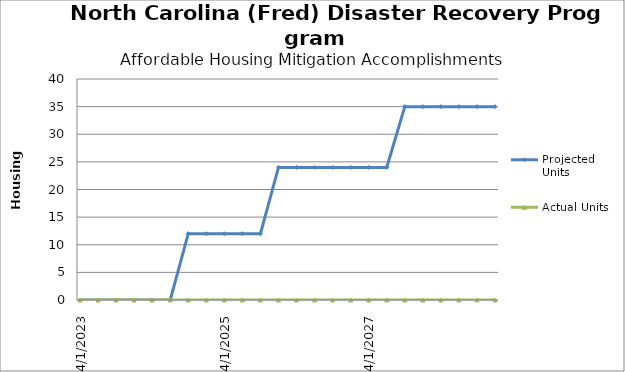
| Category | Projected Units | Actual Units |
|---|---|---|
| 4/1/23 | 0 | 0 |
| 7/1/23 | 0 | 0 |
| 10/1/23 | 0 | 0 |
| 1/1/24 | 0 | 0 |
| 4/1/24 | 0 | 0 |
| 7/1/24 | 0 | 0 |
| 10/1/24 | 12 | 0 |
| 1/1/25 | 12 | 0 |
| 4/1/25 | 12 | 0 |
| 7/1/25 | 12 | 0 |
| 10/1/25 | 12 | 0 |
| 1/1/26 | 24 | 0 |
| 4/1/26 | 24 | 0 |
| 7/1/26 | 24 | 0 |
| 10/1/26 | 24 | 0 |
| 1/1/27 | 24 | 0 |
| 4/1/27 | 24 | 0 |
| 7/1/27 | 24 | 0 |
| 10/1/27 | 35 | 0 |
| 1/1/28 | 35 | 0 |
| 4/1/28 | 35 | 0 |
| 7/1/28 | 35 | 0 |
| 10/1/28 | 35 | 0 |
| 1/1/29 | 35 | 0 |